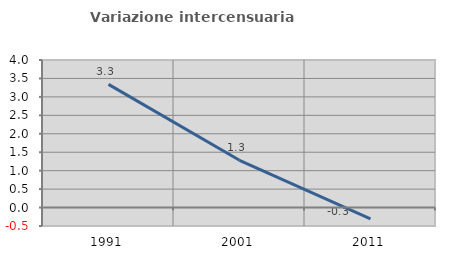
| Category | Variazione intercensuaria annua |
|---|---|
| 1991.0 | 3.34 |
| 2001.0 | 1.281 |
| 2011.0 | -0.304 |